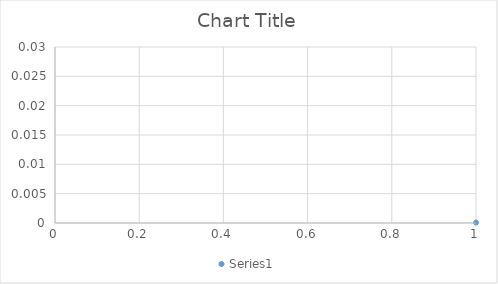
| Category | Series 0 |
|---|---|
| 0 | 0 |
| 1 | 0 |
| 2 | 0 |
| 3 | 0 |
| 4 | 0 |
| 5 | 0 |
| 6 | 0 |
| 7 | 0 |
| 8 | 0 |
| 9 | 0.001 |
| 10 | 0.001 |
| 11 | 0.001 |
| 12 | 0.001 |
| 13 | 0.001 |
| 14 | 0.001 |
| 15 | 0.002 |
| 16 | 0.002 |
| 17 | 0.002 |
| 18 | 0.003 |
| 19 | 0.003 |
| 20 | 0.003 |
| 21 | 0.004 |
| 22 | 0.005 |
| 23 | 0.005 |
| 24 | 0.006 |
| 25 | 0.007 |
| 26 | 0.007 |
| 27 | 0.008 |
| 28 | 0.009 |
| 29 | 0.01 |
| 30 | 0.011 |
| 31 | 0.012 |
| 32 | 0.013 |
| 33 | 0.014 |
| 34 | 0.016 |
| 35 | 0.017 |
| 36 | 0.018 |
| 37 | 0.019 |
| 38 | 0.02 |
| 39 | 0.021 |
| 40 | 0.022 |
| 41 | 0.023 |
| 42 | 0.024 |
| 43 | 0.025 |
| 44 | 0.026 |
| 45 | 0.026 |
| 46 | 0.027 |
| 47 | 0.027 |
| 48 | 0.027 |
| 49 | 0.027 |
| 50 | 0.027 |
| 51 | 0.027 |
| 52 | 0.027 |
| 53 | 0.027 |
| 54 | 0.026 |
| 55 | 0.026 |
| 56 | 0.025 |
| 57 | 0.024 |
| 58 | 0.023 |
| 59 | 0.022 |
| 60 | 0.021 |
| 61 | 0.02 |
| 62 | 0.019 |
| 63 | 0.018 |
| 64 | 0.017 |
| 65 | 0.016 |
| 66 | 0.014 |
| 67 | 0.013 |
| 68 | 0.012 |
| 69 | 0.011 |
| 70 | 0.01 |
| 71 | 0.009 |
| 72 | 0.008 |
| 73 | 0.007 |
| 74 | 0.007 |
| 75 | 0.006 |
| 76 | 0.005 |
| 77 | 0.005 |
| 78 | 0.004 |
| 79 | 0.003 |
| 80 | 0.003 |
| 81 | 0.003 |
| 82 | 0.002 |
| 83 | 0.002 |
| 84 | 0.002 |
| 85 | 0.001 |
| 86 | 0.001 |
| 87 | 0.001 |
| 88 | 0.001 |
| 89 | 0.001 |
| 90 | 0.001 |
| 91 | 0 |
| 92 | 0 |
| 93 | 0 |
| 94 | 0 |
| 95 | 0 |
| 96 | 0 |
| 97 | 0 |
| 98 | 0 |
| 99 | 0 |